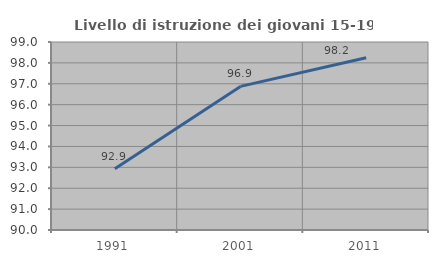
| Category | Livello di istruzione dei giovani 15-19 anni |
|---|---|
| 1991.0 | 92.937 |
| 2001.0 | 96.875 |
| 2011.0 | 98.246 |